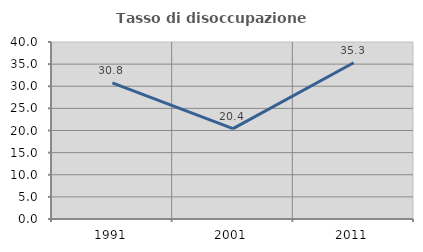
| Category | Tasso di disoccupazione giovanile  |
|---|---|
| 1991.0 | 30.769 |
| 2001.0 | 20.43 |
| 2011.0 | 35.312 |